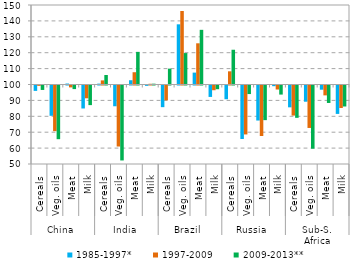
| Category | 1985-1997* | 1997-2009 | 2009-2013** |
|---|---|---|---|
| 0 | 96.605 | 99.778 | 97.206 |
| 1 | 80.944 | 71.283 | 66.236 |
| 2 | 100.609 | 98.801 | 97.738 |
| 3 | 85.544 | 91.952 | 87.661 |
| 4 | 100.547 | 102.585 | 105.965 |
| 5 | 86.942 | 61.627 | 52.859 |
| 6 | 102.681 | 107.719 | 120.524 |
| 7 | 99.779 | 100.458 | 100.514 |
| 8 | 86.375 | 90.665 | 109.976 |
| 9 | 137.847 | 146.224 | 119.757 |
| 10 | 107.478 | 125.914 | 134.381 |
| 11 | 92.806 | 97.023 | 97.666 |
| 12 | 91.352 | 108.292 | 121.855 |
| 13 | 66.363 | 69.221 | 94.613 |
| 14 | 77.968 | 68.227 | 78.212 |
| 15 | 99.567 | 97.473 | 94.291 |
| 16 | 86.268 | 81.081 | 79.664 |
| 17 | 89.802 | 73.296 | 60.25 |
| 18 | 97.352 | 93.79 | 89.015 |
| 19 | 82.132 | 85.853 | 86.8 |